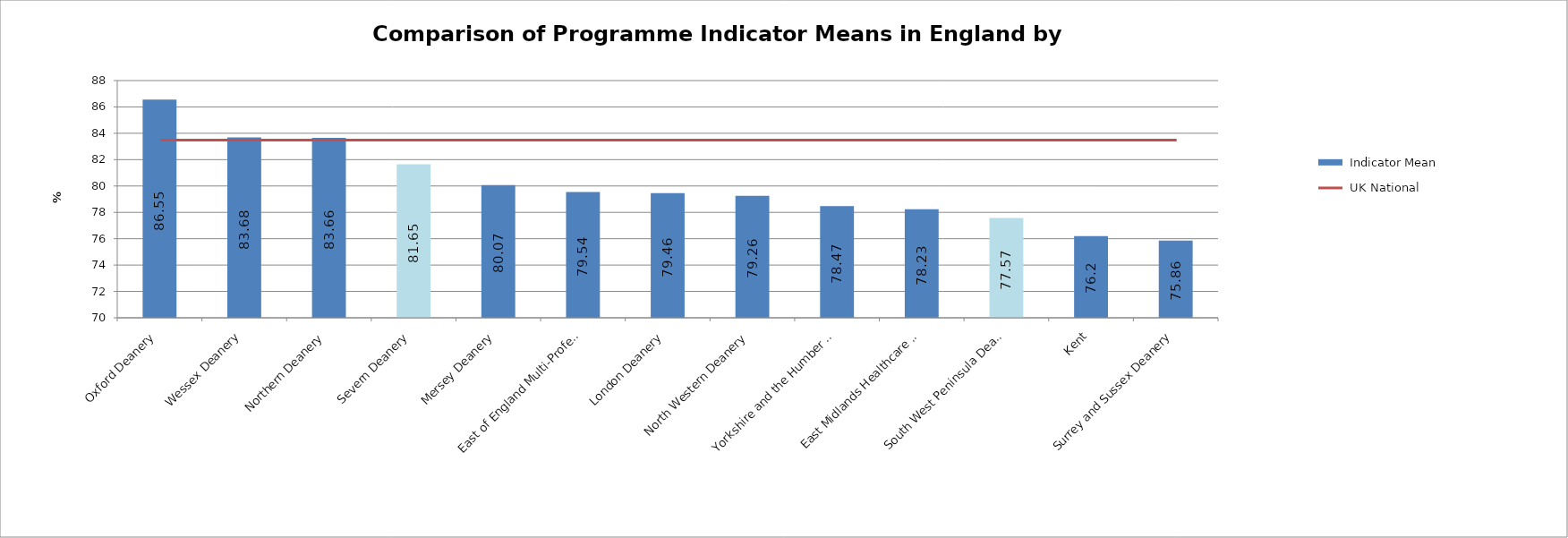
| Category |  Indicator Mean |
|---|---|
| Oxford Deanery | 86.55 |
| Wessex Deanery | 83.68 |
| Northern Deanery | 83.66 |
| Severn Deanery | 81.65 |
| Mersey Deanery | 80.07 |
| East of England Multi-Professional Deanery | 79.54 |
| London Deanery | 79.46 |
| North Western Deanery | 79.26 |
| Yorkshire and the Humber Postgraduate Deanery | 78.47 |
| East Midlands Healthcare Workforce Deanery | 78.23 |
| South West Peninsula Deanery | 77.57 |
| Kent, Surrey and Sussex Deanery | 76.2 |
| NHS West Midlands Workforce Deanery | 75.86 |